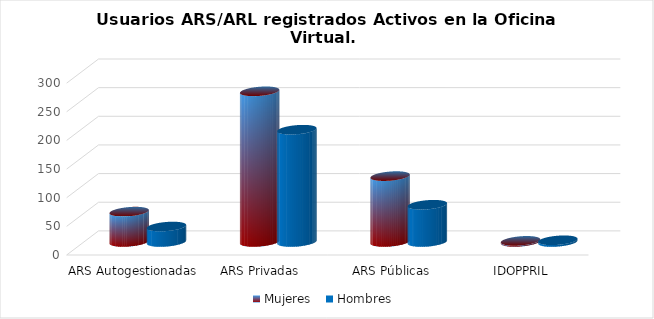
| Category | Mujeres | Hombres |
|---|---|---|
| ARS Autogestionadas | 53 | 27 |
| ARS Privadas | 263 | 196 |
| ARS Públicas | 115 | 65 |
| IDOPPRIL | 2 | 3 |